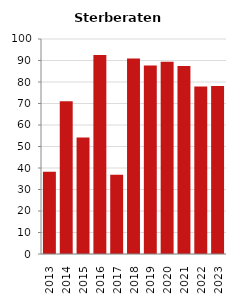
| Category | Sterberate der Bevölkerung ab 80 Jahre (auf Tsd.) |
|---|---|
| 2013.0 | 38.251 |
| 2014.0 | 71.066 |
| 2015.0 | 54.187 |
| 2016.0 | 92.593 |
| 2017.0 | 36.866 |
| 2018.0 | 90.909 |
| 2019.0 | 87.719 |
| 2020.0 | 89.362 |
| 2021.0 | 87.5 |
| 2022.0 | 77.922 |
| 2023.0 | 78.189 |